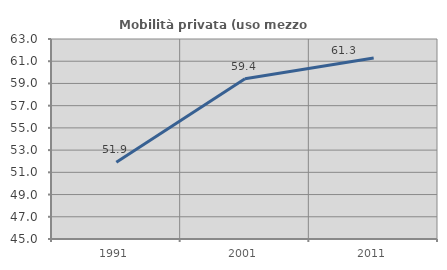
| Category | Mobilità privata (uso mezzo privato) |
|---|---|
| 1991.0 | 51.905 |
| 2001.0 | 59.426 |
| 2011.0 | 61.297 |